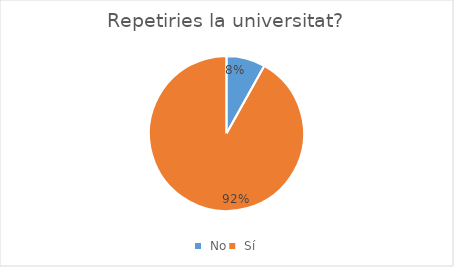
| Category | Series 0 |
|---|---|
|  No | 6 |
|  Sí | 68 |